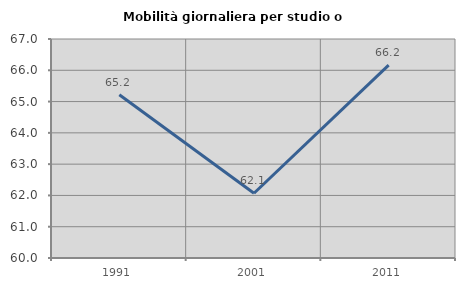
| Category | Mobilità giornaliera per studio o lavoro |
|---|---|
| 1991.0 | 65.217 |
| 2001.0 | 62.069 |
| 2011.0 | 66.165 |